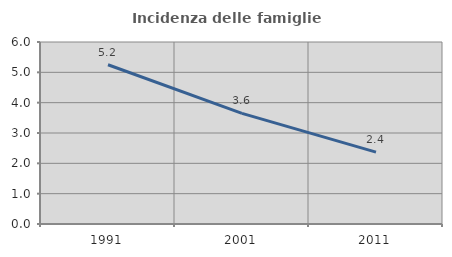
| Category | Incidenza delle famiglie numerose |
|---|---|
| 1991.0 | 5.25 |
| 2001.0 | 3.647 |
| 2011.0 | 2.369 |